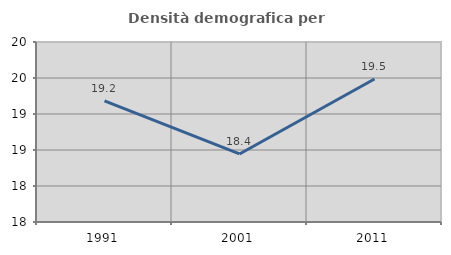
| Category | Densità demografica |
|---|---|
| 1991.0 | 19.181 |
| 2001.0 | 18.445 |
| 2011.0 | 19.487 |